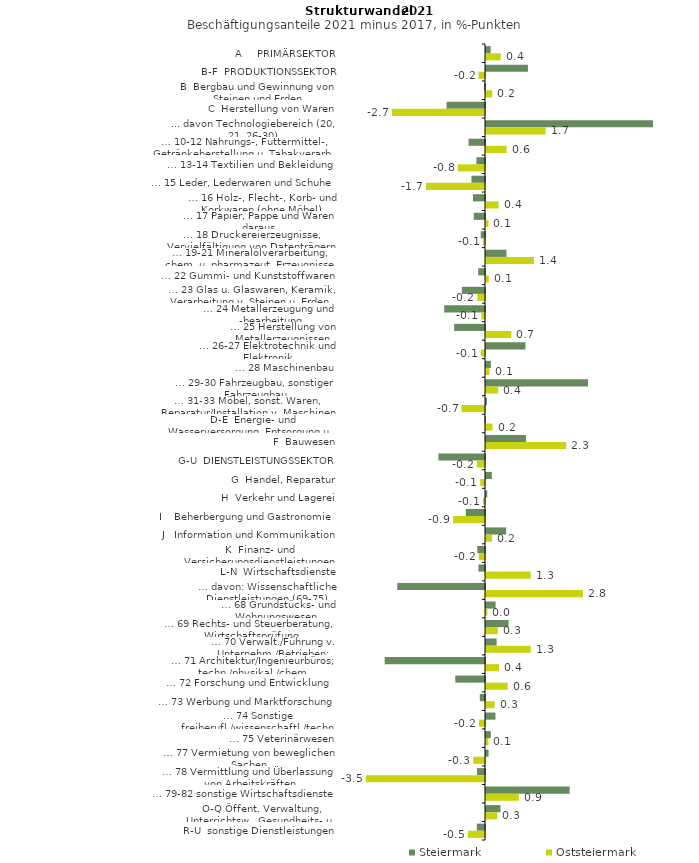
| Category | Steiermark | Oststeiermark |
|---|---|---|
| A     PRIMÄRSEKTOR | 0.135 | 0.424 |
| B-F  PRODUKTIONSSEKTOR | 1.215 | -0.185 |
| B  Bergbau und Gewinnung von Steinen und Erden | -0.029 | 0.181 |
| C  Herstellung von Waren | -1.114 | -2.699 |
| ... davon Technologiebereich (20, 21, 26-30) | 4.84 | 1.728 |
| … 10-12 Nahrungs-, Futtermittel-, Getränkeherstellung u. Tabakverarb. | -0.477 | 0.597 |
| … 13-14 Textilien und Bekleidung | -0.249 | -0.791 |
| … 15 Leder, Lederwaren und Schuhe | -0.393 | -1.71 |
| … 16 Holz-, Flecht-, Korb- und Korkwaren (ohne Möbel)  | -0.35 | 0.366 |
| … 17 Papier, Pappe und Waren daraus  | -0.325 | 0.071 |
| … 18 Druckereierzeugnisse, Vervielfältigung von Datenträgern | -0.124 | -0.057 |
| … 19-21 Mineralölverarbeitung, chem. u. pharmazeut. Erzeugnisse | 0.594 | 1.394 |
| … 22 Gummi- und Kunststoffwaren | -0.198 | 0.079 |
| … 23 Glas u. Glaswaren, Keramik, Verarbeitung v. Steinen u. Erden  | -0.671 | -0.222 |
| … 24 Metallerzeugung und -bearbeitung | -1.183 | -0.105 |
| … 25 Herstellung von Metallerzeugnissen  | -0.894 | 0.731 |
| … 26-27 Elektrotechnik und Elektronik | 1.144 | -0.122 |
| … 28 Maschinenbau | 0.141 | 0.102 |
| … 29-30 Fahrzeugbau, sonstiger Fahrzeugbau | 2.959 | 0.354 |
| … 31-33 Möbel, sonst. Waren, Reparatur/Installation v. Maschinen | 0.026 | -0.681 |
| D-E  Energie- und Wasserversorgung, Entsorgung u. Rückgewinnung | -0.016 | 0.191 |
| F  Bauwesen | 1.158 | 2.324 |
| G-U  DIENSTLEISTUNGSSEKTOR | -1.351 | -0.238 |
| G  Handel, Reparatur | 0.17 | -0.138 |
| H  Verkehr und Lagerei | 0.036 | -0.061 |
| I    Beherbergung und Gastronomie | -0.556 | -0.924 |
| J   Information und Kommunikation | 0.584 | 0.176 |
| K  Finanz- und Versicherungsdienstleistungen | -0.224 | -0.181 |
| L-N  Wirtschaftsdienste | -0.191 | 1.292 |
| … davon: Wissenschaftliche Dienstleistungen (69-75) | -2.544 | 2.809 |
| … 68 Grundstücks- und Wohnungswesen  | 0.278 | 0.041 |
| … 69 Rechts- und Steuerberatung, Wirtschaftsprüfung | 0.654 | 0.345 |
| … 70 Verwalt./Führung v. Unternehm./Betrieben; Unternehmensberat. | 0.309 | 1.298 |
| … 71 Architektur/Ingenieurbüros; techn./physikal./chem. Untersuchung | -2.908 | 0.378 |
| … 72 Forschung und Entwicklung  | -0.862 | 0.629 |
| … 73 Werbung und Marktforschung | -0.151 | 0.251 |
| … 74 Sonstige freiberufl./wissenschaftl./techn. Tätigkeiten | 0.275 | -0.174 |
| … 75 Veterinärwesen | 0.139 | 0.071 |
| … 77 Vermietung von beweglichen Sachen  | 0.075 | -0.343 |
| … 78 Vermittlung und Überlassung von Arbeitskräften | -0.233 | -3.457 |
| … 79-82 sonstige Wirtschaftsdienste | 2.426 | 0.95 |
| O-Q Öffent. Verwaltung, Unterrichtsw., Gesundheits- u. Sozialwesen | 0.419 | 0.327 |
| R-U  sonstige Dienstleistungen | -0.238 | -0.497 |